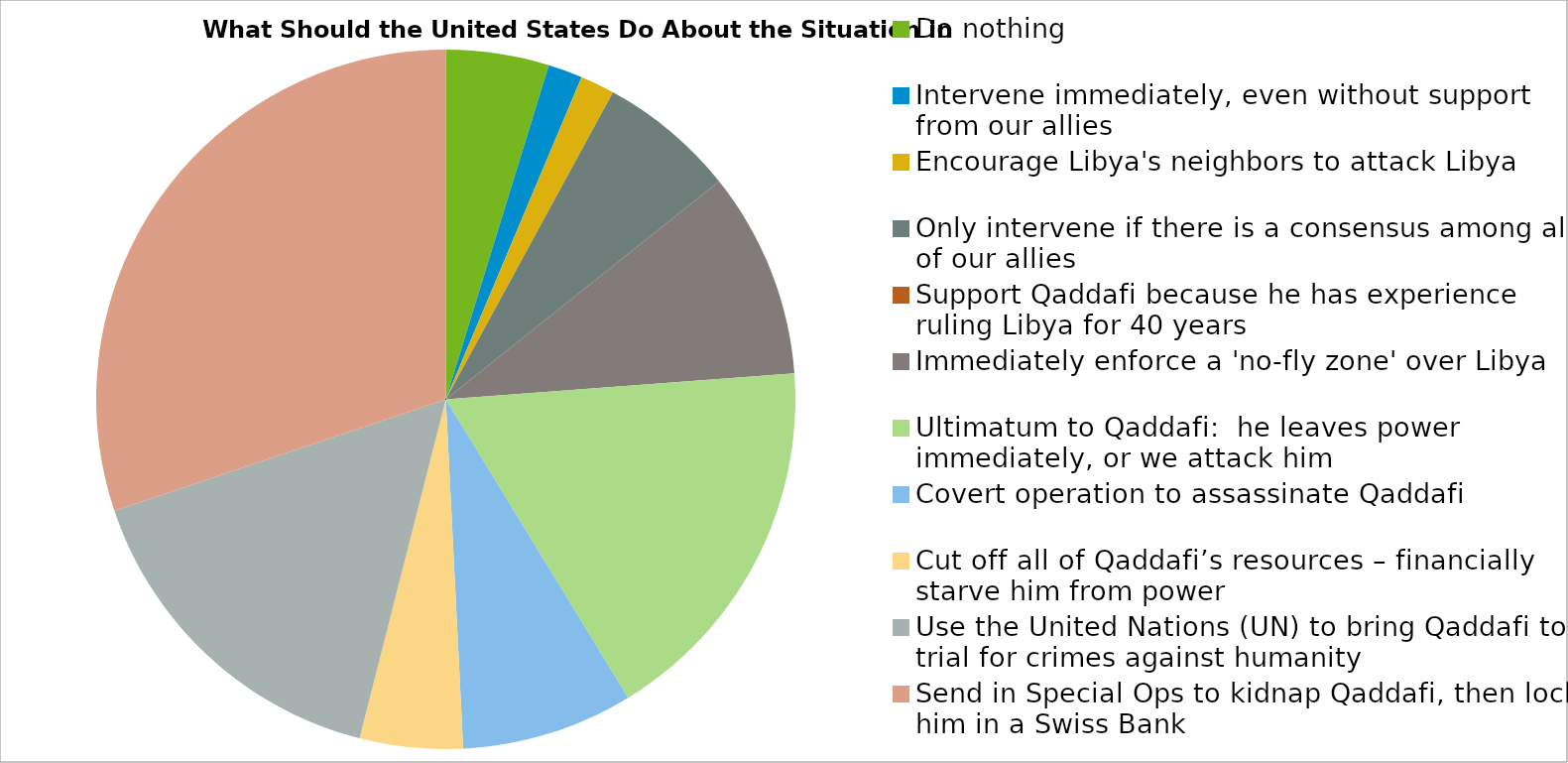
| Category | Series 0 |
|---|---|
| Do nothing | 3 |
| Intervene immediately, even without support from our allies | 1 |
| Encourage Libya's neighbors to attack Libya | 1 |
| Only intervene if there is a consensus among all of our allies | 4 |
| Support Qaddafi because he has experience ruling Libya for 40 years | 0 |
| Immediately enforce a 'no-fly zone' over Libya | 6 |
| Ultimatum to Qaddafi:  he leaves power immediately, or we attack him | 11 |
| Covert operation to assassinate Qaddafi | 5 |
| Cut off all of Qaddafi’s resources – financially starve him from power | 3 |
| Use the United Nations (UN) to bring Qaddafi to trial for crimes against humanity | 10 |
| Send in Special Ops to kidnap Qaddafi, then lock him in a Swiss Bank | 19 |